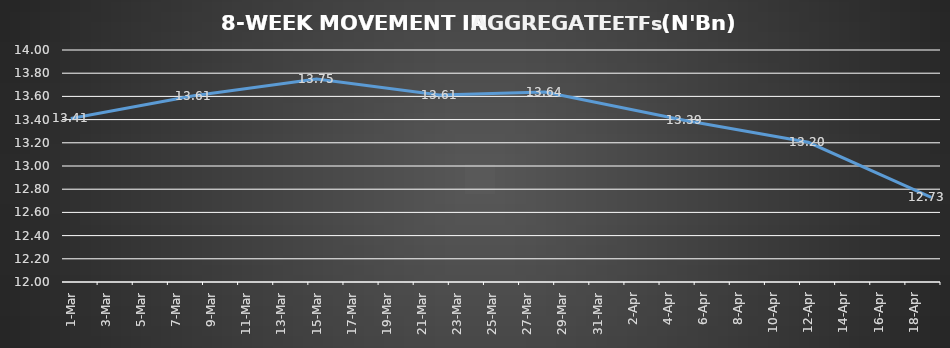
| Category | ETFs AGGREGATE |
|---|---|
| 2024-03-01 | 13.41 |
| 2024-03-08 | 13.605 |
| 2024-03-15 | 13.75 |
| 2024-03-22 | 13.612 |
| 2024-03-28 | 13.638 |
| 2024-04-05 | 13.392 |
| 2024-04-12 | 13.205 |
| 2024-04-19 | 12.73 |